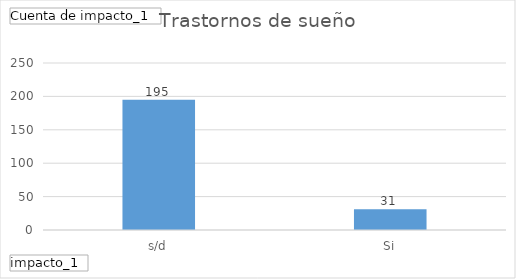
| Category | Total |
|---|---|
| s/d | 195 |
| Si | 31 |